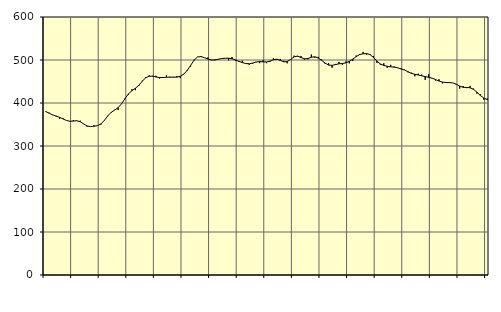
| Category | Piggar | Series 1 |
|---|---|---|
| nan | 381.1 | 380.06 |
| 87.0 | 377.4 | 376.34 |
| 87.0 | 371.9 | 372.47 |
| 87.0 | 370.3 | 369.42 |
| nan | 363.4 | 366.69 |
| 88.0 | 364.9 | 363.06 |
| 88.0 | 359.2 | 359.36 |
| 88.0 | 357 | 357.47 |
| nan | 360.5 | 358.01 |
| 89.0 | 358.1 | 358.78 |
| 89.0 | 358.9 | 356.53 |
| 89.0 | 351.1 | 351.32 |
| nan | 345 | 346.56 |
| 90.0 | 345.1 | 345.12 |
| 90.0 | 348.2 | 345.97 |
| 90.0 | 346.9 | 347.38 |
| nan | 349.5 | 351.33 |
| 91.0 | 359 | 359.55 |
| 91.0 | 369.3 | 370.07 |
| 91.0 | 377.6 | 378.51 |
| nan | 384.3 | 383.52 |
| 92.0 | 383.8 | 389.17 |
| 92.0 | 398.3 | 398.34 |
| 92.0 | 411.5 | 410.36 |
| nan | 419.5 | 421.38 |
| 93.0 | 432 | 428.66 |
| 93.0 | 429.8 | 434.32 |
| 93.0 | 440 | 441.44 |
| nan | 452.1 | 450.78 |
| 94.0 | 460.4 | 458.74 |
| 94.0 | 464.4 | 462.29 |
| 94.0 | 463.3 | 462.26 |
| nan | 463.1 | 460.53 |
| 95.0 | 457.1 | 459.21 |
| 95.0 | 459 | 459.27 |
| 95.0 | 464.6 | 459.88 |
| nan | 459 | 460.31 |
| 96.0 | 460.8 | 460.04 |
| 96.0 | 462.3 | 460.07 |
| 96.0 | 457.6 | 462.13 |
| nan | 467.7 | 466.79 |
| 97.0 | 474.5 | 475.64 |
| 97.0 | 485 | 487.38 |
| 97.0 | 500.5 | 499.43 |
| nan | 507.3 | 507.02 |
| 98.0 | 509.3 | 507.89 |
| 98.0 | 505.3 | 505.36 |
| 98.0 | 505.8 | 502.39 |
| nan | 499.4 | 500.19 |
| 99.0 | 501.1 | 499.91 |
| 99.0 | 502 | 501.82 |
| 99.0 | 503.9 | 503.51 |
| nan | 504.2 | 504.11 |
| 0.0 | 499 | 504.19 |
| 0.0 | 507 | 502.93 |
| 0.0 | 498.4 | 500.08 |
| nan | 496.1 | 496.9 |
| 1.0 | 498.4 | 494.04 |
| 1.0 | 491.6 | 491.75 |
| 1.0 | 488.6 | 491.24 |
| nan | 491.6 | 492.91 |
| 2.0 | 495 | 495.24 |
| 2.0 | 492.7 | 496.29 |
| 2.0 | 499.4 | 495.61 |
| nan | 492.6 | 495.36 |
| 3.0 | 495.4 | 497.07 |
| 3.0 | 503.8 | 500.61 |
| 3.0 | 500 | 501.97 |
| nan | 502.6 | 499.05 |
| 4.0 | 498.2 | 495.76 |
| 4.0 | 492.3 | 496.23 |
| 4.0 | 501.9 | 501.27 |
| nan | 510 | 507.34 |
| 5.0 | 508 | 509.1 |
| 5.0 | 509.4 | 505.85 |
| 5.0 | 500.8 | 502.8 |
| nan | 501.4 | 503.41 |
| 6.0 | 512.7 | 506.28 |
| 6.0 | 505.4 | 507.62 |
| 6.0 | 507.4 | 504.55 |
| nan | 500.9 | 499.07 |
| 7.0 | 491.2 | 492.77 |
| 7.0 | 493 | 488.18 |
| 7.0 | 482 | 487.55 |
| nan | 490.9 | 489.29 |
| 8.0 | 495.5 | 491.08 |
| 8.0 | 488.5 | 491.91 |
| 8.0 | 496.6 | 493.35 |
| nan | 492.2 | 496.77 |
| 9.0 | 497.6 | 501.93 |
| 9.0 | 510.3 | 507.87 |
| 9.0 | 513.9 | 512.62 |
| nan | 518.8 | 514.52 |
| 10.0 | 512.6 | 514.85 |
| 10.0 | 513.9 | 512.65 |
| 10.0 | 509.1 | 506.07 |
| nan | 493.2 | 497.39 |
| 11.0 | 489.3 | 490.88 |
| 11.0 | 492.4 | 487.35 |
| 11.0 | 481.6 | 485.48 |
| nan | 488.9 | 484.19 |
| 12.0 | 484.8 | 483.37 |
| 12.0 | 481.3 | 481.91 |
| 12.0 | 480.9 | 479.27 |
| nan | 477.5 | 476.72 |
| 13.0 | 471.4 | 472.83 |
| 13.0 | 470.5 | 468.9 |
| 13.0 | 462 | 466.8 |
| nan | 468.2 | 465.08 |
| 14.0 | 466 | 463.27 |
| 14.0 | 453.9 | 461.4 |
| 14.0 | 466.6 | 459.73 |
| nan | 458.1 | 457.76 |
| 15.0 | 452.4 | 454.41 |
| 15.0 | 455.2 | 451.06 |
| 15.0 | 445.6 | 448.69 |
| nan | 449 | 447.33 |
| 16.0 | 446.6 | 447.53 |
| 16.0 | 446.7 | 446.78 |
| 16.0 | 442.4 | 443.67 |
| nan | 433.6 | 439.37 |
| 17.0 | 439.5 | 436.44 |
| 17.0 | 434.6 | 436.14 |
| 17.0 | 439.8 | 435.41 |
| nan | 433.5 | 431.91 |
| 18.0 | 421.8 | 425.21 |
| 18.0 | 420.1 | 417.34 |
| 18.0 | 407.8 | 411.57 |
| nan | 410.3 | 407.8 |